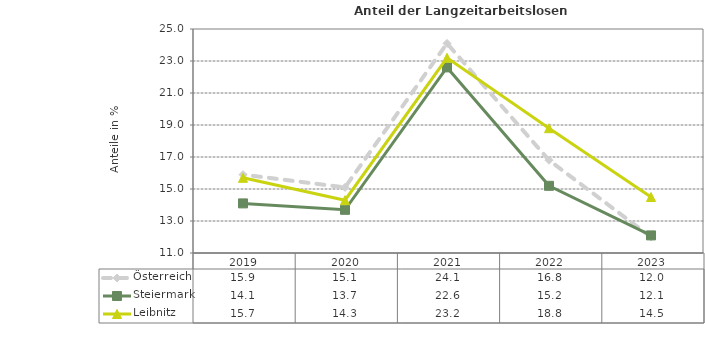
| Category | Österreich | Steiermark | Leibnitz |
|---|---|---|---|
| 2023.0 | 12 | 12.1 | 14.5 |
| 2022.0 | 16.8 | 15.2 | 18.8 |
| 2021.0 | 24.1 | 22.6 | 23.2 |
| 2020.0 | 15.1 | 13.7 | 14.3 |
| 2019.0 | 15.9 | 14.1 | 15.7 |